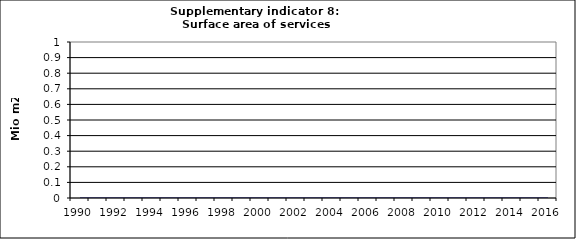
| Category | Surface area of services buildings, Mio m2 |
|---|---|
| 1990 | 0 |
| 1991 | 0 |
| 1992 | 0 |
| 1993 | 0 |
| 1994 | 0 |
| 1995 | 0 |
| 1996 | 0 |
| 1997 | 0 |
| 1998 | 0 |
| 1999 | 0 |
| 2000 | 0 |
| 2001 | 0 |
| 2002 | 0 |
| 2003 | 0 |
| 2004 | 0 |
| 2005 | 0 |
| 2006 | 0 |
| 2007 | 0 |
| 2008 | 0 |
| 2009 | 0 |
| 2010 | 0 |
| 2011 | 0 |
| 2012 | 0 |
| 2013 | 0 |
| 2014 | 0 |
| 2015 | 0 |
| 2016 | 0 |